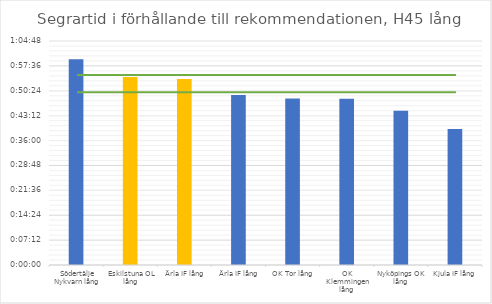
| Category | H45 tid |
|---|---|
| Södertälje Nykvarn lång | 0.041 |
| Eskilstuna OL lång | 0.038 |
| Ärla IF lång | 0.037 |
| Ärla IF lång | 0.034 |
| OK Tor lång | 0.033 |
| OK Klemmingen lång | 0.033 |
| Nyköpings OK lång | 0.031 |
| Kjula IF lång | 0.027 |